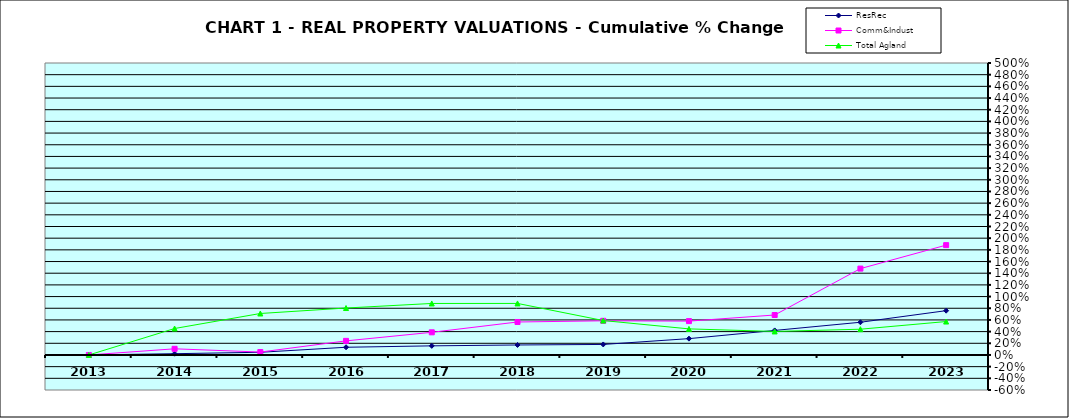
| Category | ResRec | Comm&Indust | Total Agland |
|---|---|---|---|
| 2013.0 | 0 | 0 | 0 |
| 2014.0 | 0.022 | 0.105 | 0.453 |
| 2015.0 | 0.046 | 0.05 | 0.71 |
| 2016.0 | 0.132 | 0.241 | 0.804 |
| 2017.0 | 0.156 | 0.388 | 0.882 |
| 2018.0 | 0.171 | 0.565 | 0.883 |
| 2019.0 | 0.18 | 0.585 | 0.59 |
| 2020.0 | 0.28 | 0.58 | 0.447 |
| 2021.0 | 0.42 | 0.684 | 0.403 |
| 2022.0 | 0.56 | 1.479 | 0.441 |
| 2023.0 | 0.759 | 1.881 | 0.572 |